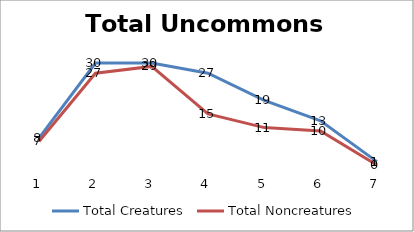
| Category | Total Creatures | Total Noncreatures |
|---|---|---|
| 0 | 8 | 7 |
| 1 | 30 | 27 |
| 2 | 30 | 29 |
| 3 | 27 | 15 |
| 4 | 19 | 11 |
| 5 | 13 | 10 |
| 6 | 1 | 0 |